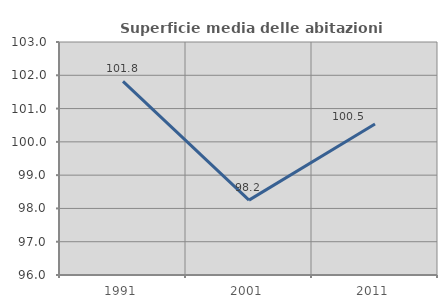
| Category | Superficie media delle abitazioni occupate |
|---|---|
| 1991.0 | 101.819 |
| 2001.0 | 98.249 |
| 2011.0 | 100.534 |